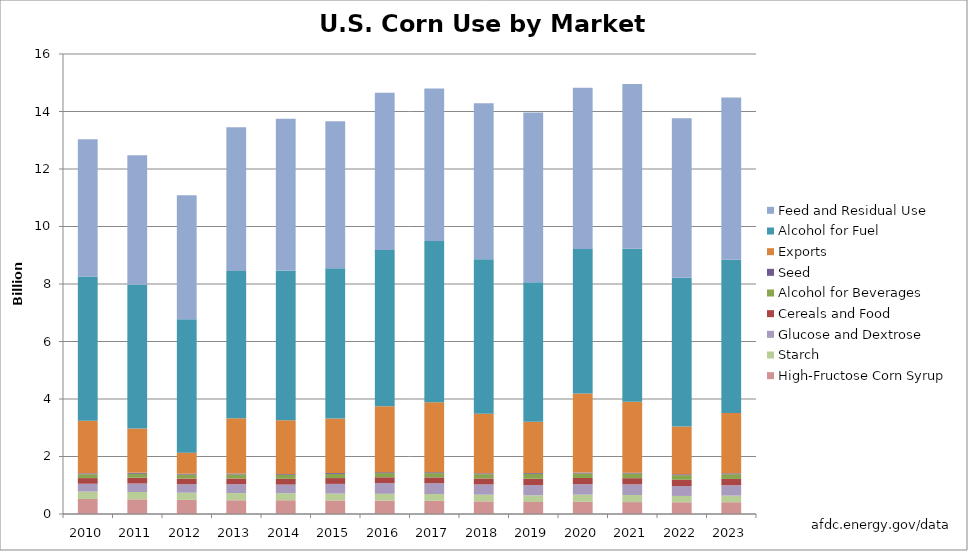
| Category | High-Fructose Corn Syrup | Starch | Glucose and Dextrose | Cereals and Food | Alcohol for Beverages | Seed | Exports | Alcohol for Fuel | Feed and Residual Use |
|---|---|---|---|---|---|---|---|---|---|
| 2010.0 | 521.05 | 258.38 | 272.36 | 197 | 135 | 29.58 | 1831 | 5018.74 | 4770 |
| 2011.0 | 511.6 | 254.01 | 294.36 | 203.23 | 136.5 | 30.99 | 1539 | 5000.03 | 4512 |
| 2012.0 | 491.49 | 249.39 | 291.92 | 199.42 | 140 | 30.96 | 730 | 4641.13 | 4309 |
| 2013.0 | 477.74 | 250.55 | 307.15 | 200.48 | 141.5 | 29.72 | 1921 | 5123.6 | 5004 |
| 2014.0 | 478.1 | 246.45 | 298.07 | 201.21 | 142.19 | 29.26 | 1867 | 5200.09 | 5287 |
| 2015.0 | 472.26 | 237.58 | 337.04 | 203.1 | 143 | 30.56 | 1899 | 5223.61 | 5118 |
| 2016.0 | 466.98 | 235.35 | 371.35 | 204.3 | 146 | 29.3 | 2296 | 5431.95 | 5468 |
| 2017.0 | 459.22 | 235.74 | 372 | 206.7 | 149 | 29.64 | 2437 | 5604.83 | 5304 |
| 2018.0 | 441 | 231 | 355 | 208.8 | 150 | 29 | 2068 | 5378 | 5427 |
| 2019.0 | 418 | 232 | 356 | 220 | 173 | 30 | 1777 | 4857 | 5898 |
| 2020.0 | 421 | 252 | 365 | 214 | 157 | 31 | 2747 | 5028 | 5607 |
| 2021.0 | 415 | 246 | 371 | 214 | 161 | 29 | 2471 | 5320 | 5726 |
| 2022.0 | 409 | 219 | 344 | 217 | 162 | 31 | 1661 | 5176 | 5549 |
| 2023.0 | 410 | 230 | 360 | 219 | 165 | 31 | 2100 | 5325 | 5650 |